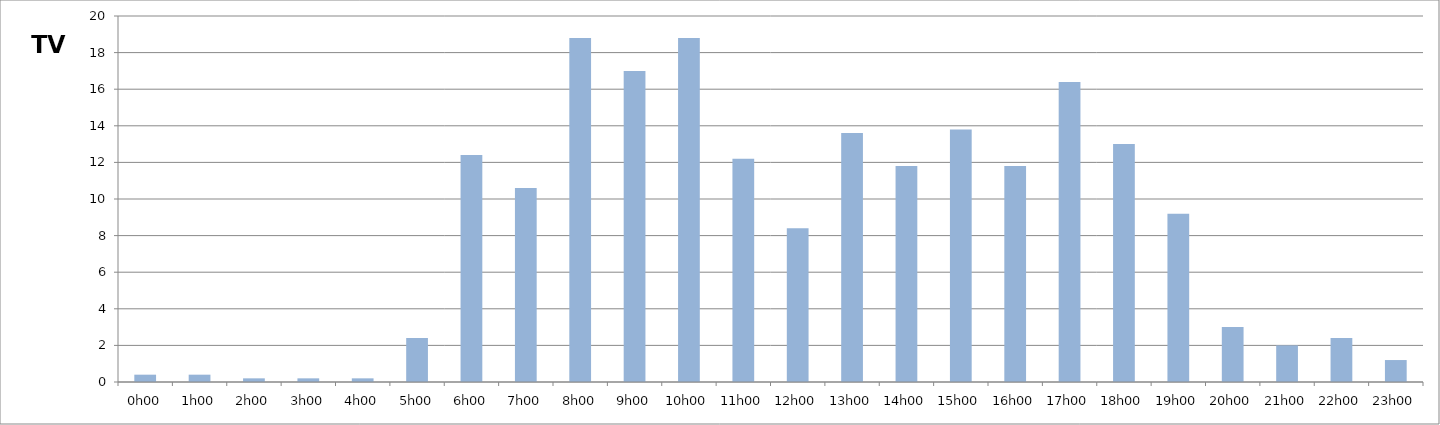
| Category | TV |
|---|---|
| 0.0 | 0.4 |
| 0.041666666666666664 | 0.4 |
| 0.08333333333333333 | 0.2 |
| 0.125 | 0.2 |
| 0.16666666666666666 | 0.2 |
| 0.20833333333333334 | 2.4 |
| 0.25 | 12.4 |
| 0.2916666666666667 | 10.6 |
| 0.3333333333333333 | 18.8 |
| 0.375 | 17 |
| 0.4166666666666667 | 18.8 |
| 0.4583333333333333 | 12.2 |
| 0.5 | 8.4 |
| 0.5416666666666666 | 13.6 |
| 0.5833333333333334 | 11.8 |
| 0.625 | 13.8 |
| 0.6666666666666666 | 11.8 |
| 0.7083333333333334 | 16.4 |
| 0.75 | 13 |
| 0.7916666666666666 | 9.2 |
| 0.8333333333333334 | 3 |
| 0.875 | 2 |
| 0.9166666666666666 | 2.4 |
| 0.9583333333333334 | 1.2 |